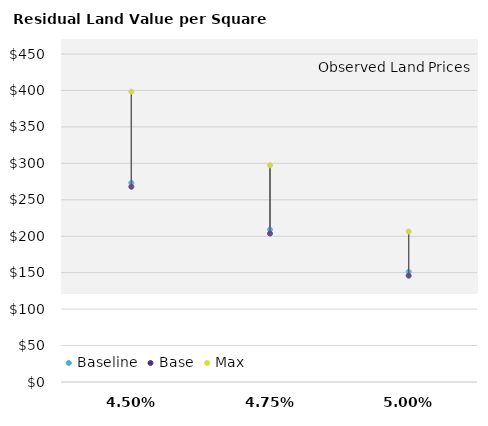
| Category | Baseline | Base | Max |
|---|---|---|---|
| 0.045 | 273.173 | 267.871 | 398.307 |
| 0.0475 | 208.962 | 203.66 | 297.299 |
| 0.05 | 151.172 | 145.87 | 206.391 |